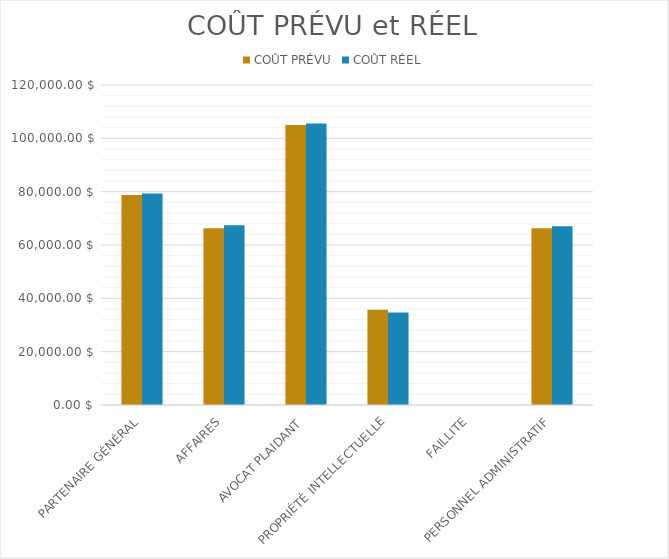
| Category | COÛT PRÉVU | COÛT RÉEL |
|---|---|---|
| PARTENAIRE GÉNÉRAL | 78750 | 79275 |
| AFFAIRES | 66250 | 67375 |
| AVOCAT PLAIDANT | 105000 | 105600 |
| PROPRIÉTÉ INTELLECTUELLE | 35750 | 34650 |
| FAILLITE | 0 | 0 |
| PERSONNEL ADMINISTRATIF | 66250 | 67000 |